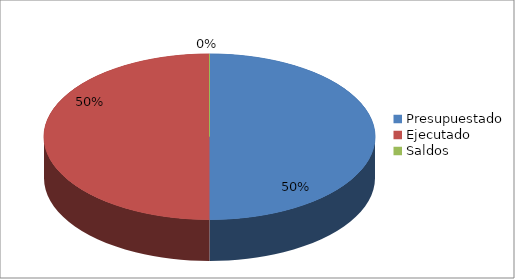
| Category | Series 0 |
|---|---|
| Presupuestado | 11489734442 |
| Ejecutado | 11489734442 |
| Saldos | 0 |